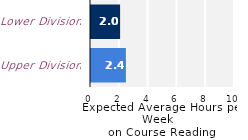
| Category | Series 0 |
|---|---|
| Upper Division | 2.424 |
| Lower Division | 2.02 |